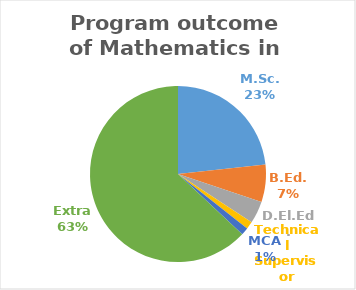
| Category | Series 0 |
|---|---|
| M.Sc. | 17 |
| B.Ed. | 5 |
| D.El.Ed. | 3 |
| Technical Supervisor | 1 |
| MCA | 1 |
| Extra | 46 |